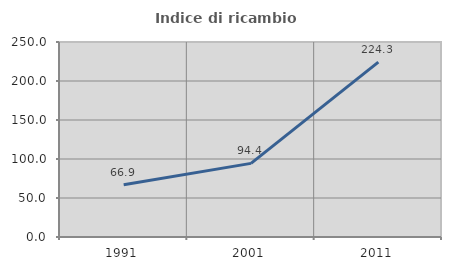
| Category | Indice di ricambio occupazionale  |
|---|---|
| 1991.0 | 66.906 |
| 2001.0 | 94.406 |
| 2011.0 | 224.286 |